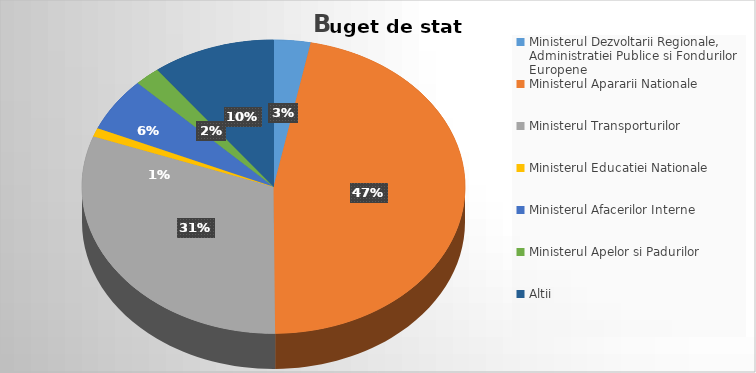
| Category | Series 0 |
|---|---|
| Ministerul Dezvoltarii Regionale, Administratiei Publice si Fondurilor Europene | 3.109 |
| Ministerul Apararii Nationale | 46.756 |
| Ministerul Transporturilor | 30.69 |
| Ministerul Educatiei Nationale | 0.949 |
| Ministerul Afacerilor Interne | 5.969 |
| Ministerul Apelor si Padurilor | 2.166 |
| Altii | 10.361 |